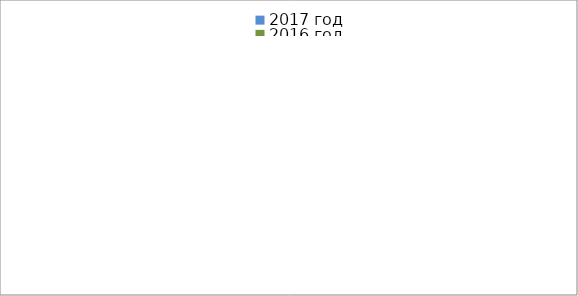
| Category | 2017 год | 2016 год |
|---|---|---|
|  - поджог | 7 | 9 |
|  - неосторожное обращение с огнём | 2 | 2 |
|  - НПТЭ электрооборудования | 13 | 12 |
|  - НПУ и Э печей | 40 | 26 |
|  - НПУ и Э транспортных средств | 26 | 33 |
|   -Шалость с огнем детей | 3 | 3 |
|  -НППБ при эксплуатации эл.приборов | 12 | 18 |
|  - курение | 15 | 16 |
| - прочие | 39 | 41 |
| - не установленные причины | 0 | 0 |